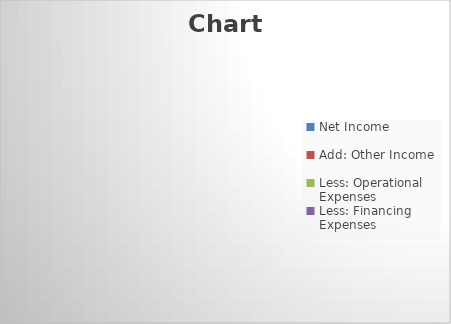
| Category | Series 0 |
|---|---|
| Net Income | 0 |
| Add: Other Income | 0 |
| Less: Operational Expenses | 0 |
| Less: Financing Expenses | 0 |